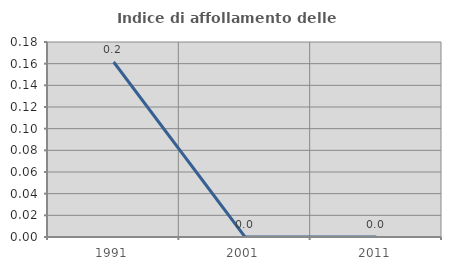
| Category | Indice di affollamento delle abitazioni  |
|---|---|
| 1991.0 | 0.162 |
| 2001.0 | 0 |
| 2011.0 | 0 |